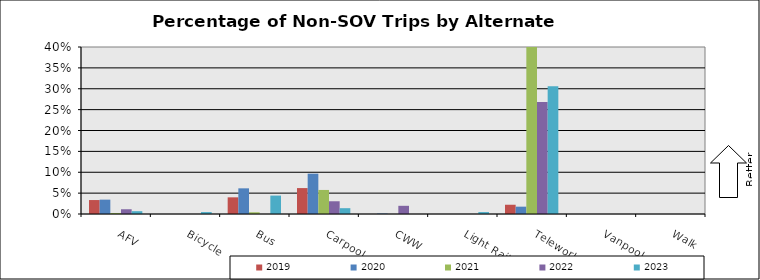
| Category | 2019 | 2020 | 2021 | 2022 | 2023 |
|---|---|---|---|---|---|
| AFV | 0.033 | 0.034 | 0.002 | 0.011 | 0.007 |
| Bicycle | 0 | 0 | 0 | 0 | 0.005 |
| Bus | 0.04 | 0.061 | 0.004 | 0 | 0.044 |
| Carpool | 0.062 | 0.097 | 0.058 | 0.031 | 0.014 |
| CWW | 0 | 0.001 | 0 | 0.02 | 0 |
| Light Rail | 0 | 0 | 0 | 0 | 0.005 |
| Telework | 0.022 | 0.018 | 0.471 | 0.268 | 0.306 |
| Vanpool | 0 | 0 | 0 | 0 | 0 |
| Walk | 0 | 0 | 0 | 0 | 0 |